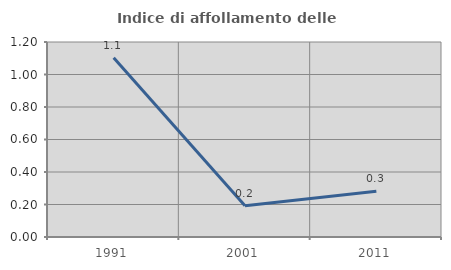
| Category | Indice di affollamento delle abitazioni  |
|---|---|
| 1991.0 | 1.103 |
| 2001.0 | 0.192 |
| 2011.0 | 0.281 |